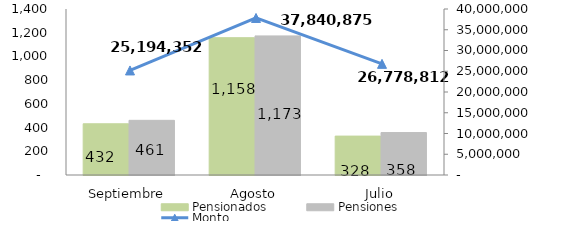
| Category | Pensionados | Pensiones |
|---|---|---|
| Septiembre | 432 | 461 |
| Agosto | 1158 | 1173 |
| Julio | 328 | 358 |